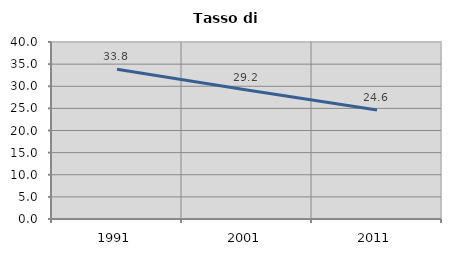
| Category | Tasso di disoccupazione   |
|---|---|
| 1991.0 | 33.828 |
| 2001.0 | 29.159 |
| 2011.0 | 24.623 |